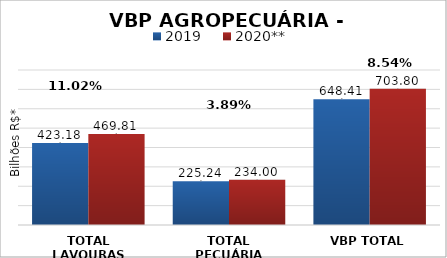
| Category | 2019 | 2020** |
|---|---|---|
| TOTAL LAVOURAS | 423.179 | 469.809 |
| TOTAL PECUÁRIA | 225.235 | 233.996 |
| VBP TOTAL | 648.414 | 703.805 |